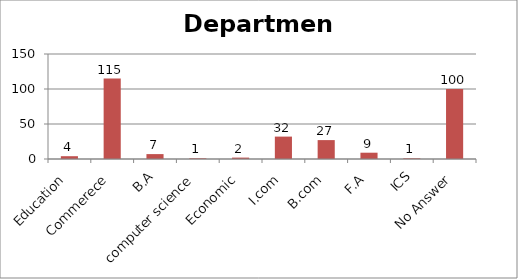
| Category | Department |
|---|---|
| Education | 4 |
| Commerece | 115 |
| B.A | 7 |
| computer science | 1 |
| Economic | 2 |
| I.com | 32 |
| B.com | 27 |
| F.A | 9 |
| ICS | 1 |
| No Answer | 100 |